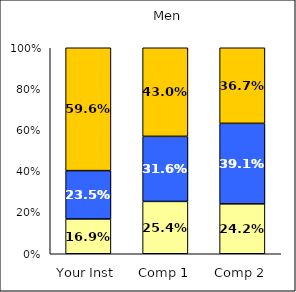
| Category | Low UG Ed Goal: Personal Development | Average UG Ed Goal: Personal Development | High UG Ed Goal: Personal Development |
|---|---|---|---|
| Your Inst | 0.169 | 0.235 | 0.596 |
| Comp 1 | 0.254 | 0.316 | 0.43 |
| Comp 2 | 0.242 | 0.391 | 0.367 |